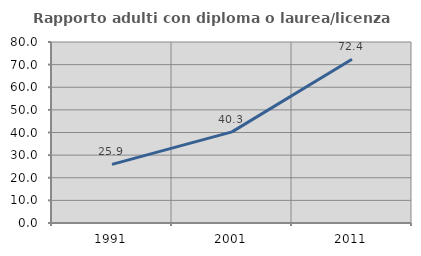
| Category | Rapporto adulti con diploma o laurea/licenza media  |
|---|---|
| 1991.0 | 25.926 |
| 2001.0 | 40.278 |
| 2011.0 | 72.368 |